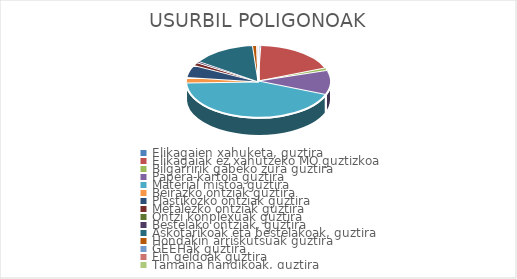
| Category | USURBIL POLIGONOAK |
|---|---|
| Elikagaien xahuketa, guztira | 0.006 |
| Elikagaiak ez xahutzeko MO guztizkoa | 0.185 |
| Bilgarririk gabeko zura guztira | 0.012 |
| Papera-kartoia guztira | 0.108 |
| Material mistoa guztira | 0.434 |
| Beirazko ontziak guztira | 0.024 |
| Plastikozko ontziak guztira | 0.056 |
| Metalezko ontziak guztira | 0.014 |
| Ontzi konplexuak guztira | 0 |
| Bestelako ontziak, guztira | 0.006 |
| Askotarikoak eta bestelakoak, guztira | 0.142 |
| Hondakin arriskutsuak guztira | 0.01 |
| GEEHak guztira | 0 |
| Fin geldoak guztira | 0.003 |
| Tamaina handikoak, guztira | 0 |